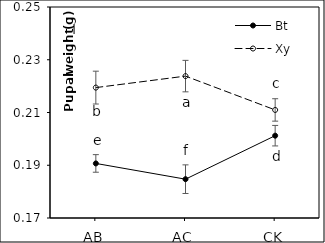
| Category | Bt | Xy |
|---|---|---|
| AB | 0.191 | 0.219 |
| AC | 0.185 | 0.224 |
| CK | 0.201 | 0.211 |